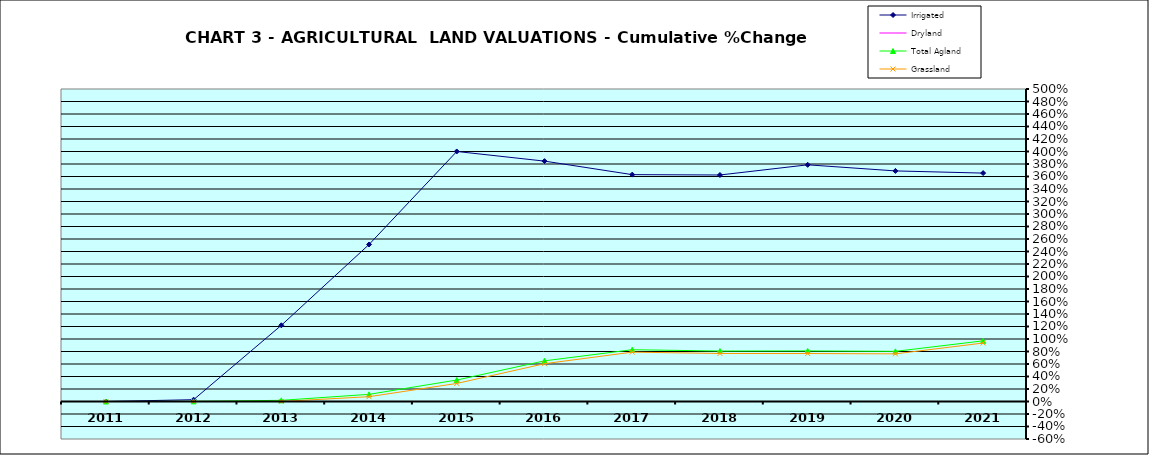
| Category | Irrigated | Dryland | Total Agland | Grassland |
|---|---|---|---|---|
| 2011.0 | 0 | 0 | 0 | 0 |
| 2012.0 | 0.029 | 0 | 0.002 | 0 |
| 2013.0 | 1.219 | 0 | 0.019 | 0.001 |
| 2014.0 | 2.512 | 0 | 0.115 | 0.077 |
| 2015.0 | 4 | 0 | 0.344 | 0.289 |
| 2016.0 | 3.846 | 0 | 0.651 | 0.605 |
| 2017.0 | 3.63 | 0 | 0.829 | 0.79 |
| 2018.0 | 3.624 | 0 | 0.807 | 0.768 |
| 2019.0 | 3.787 | 0 | 0.809 | 0.767 |
| 2020.0 | 3.689 | 0 | 0.803 | 0.762 |
| 2021.0 | 3.654 | 0 | 0.971 | 0.935 |